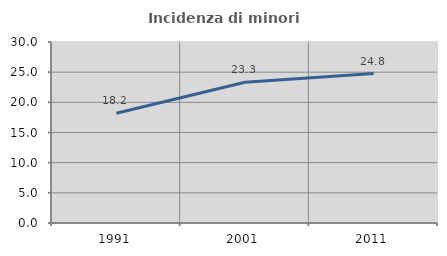
| Category | Incidenza di minori stranieri |
|---|---|
| 1991.0 | 18.182 |
| 2001.0 | 23.333 |
| 2011.0 | 24.771 |